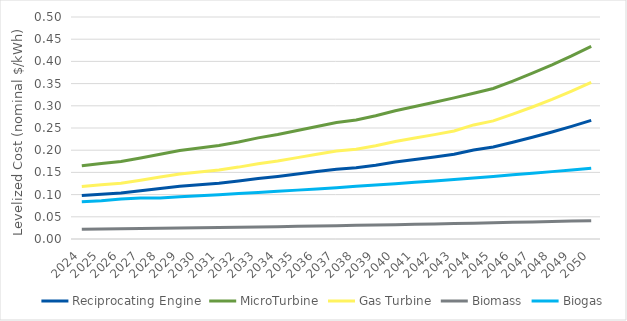
| Category | Reciprocating Engine | MicroTurbine | Gas Turbine | Biomass | Biogas |
|---|---|---|---|---|---|
| 2024.0 | 0.098 | 0.165 | 0.118 | 0.022 | 0.084 |
| 2025.0 | 0.101 | 0.17 | 0.122 | 0.022 | 0.086 |
| 2026.0 | 0.104 | 0.174 | 0.126 | 0.023 | 0.09 |
| 2027.0 | 0.109 | 0.182 | 0.132 | 0.023 | 0.093 |
| 2028.0 | 0.114 | 0.191 | 0.139 | 0.024 | 0.093 |
| 2029.0 | 0.119 | 0.199 | 0.147 | 0.025 | 0.095 |
| 2030.0 | 0.122 | 0.205 | 0.151 | 0.025 | 0.097 |
| 2031.0 | 0.126 | 0.211 | 0.156 | 0.026 | 0.1 |
| 2032.0 | 0.131 | 0.219 | 0.162 | 0.027 | 0.102 |
| 2033.0 | 0.136 | 0.228 | 0.17 | 0.027 | 0.105 |
| 2034.0 | 0.141 | 0.235 | 0.176 | 0.028 | 0.107 |
| 2035.0 | 0.146 | 0.244 | 0.183 | 0.029 | 0.11 |
| 2036.0 | 0.152 | 0.254 | 0.191 | 0.029 | 0.113 |
| 2037.0 | 0.157 | 0.262 | 0.198 | 0.03 | 0.116 |
| 2038.0 | 0.161 | 0.268 | 0.202 | 0.031 | 0.119 |
| 2039.0 | 0.166 | 0.278 | 0.21 | 0.032 | 0.122 |
| 2040.0 | 0.173 | 0.289 | 0.22 | 0.032 | 0.125 |
| 2041.0 | 0.179 | 0.298 | 0.227 | 0.033 | 0.128 |
| 2042.0 | 0.185 | 0.308 | 0.235 | 0.034 | 0.131 |
| 2043.0 | 0.191 | 0.318 | 0.243 | 0.035 | 0.134 |
| 2044.0 | 0.2 | 0.328 | 0.257 | 0.036 | 0.137 |
| 2045.0 | 0.207 | 0.339 | 0.266 | 0.037 | 0.141 |
| 2046.0 | 0.218 | 0.356 | 0.281 | 0.037 | 0.144 |
| 2047.0 | 0.229 | 0.373 | 0.297 | 0.038 | 0.148 |
| 2048.0 | 0.241 | 0.392 | 0.315 | 0.039 | 0.152 |
| 2049.0 | 0.254 | 0.412 | 0.333 | 0.04 | 0.156 |
| 2050.0 | 0.267 | 0.434 | 0.353 | 0.041 | 0.159 |